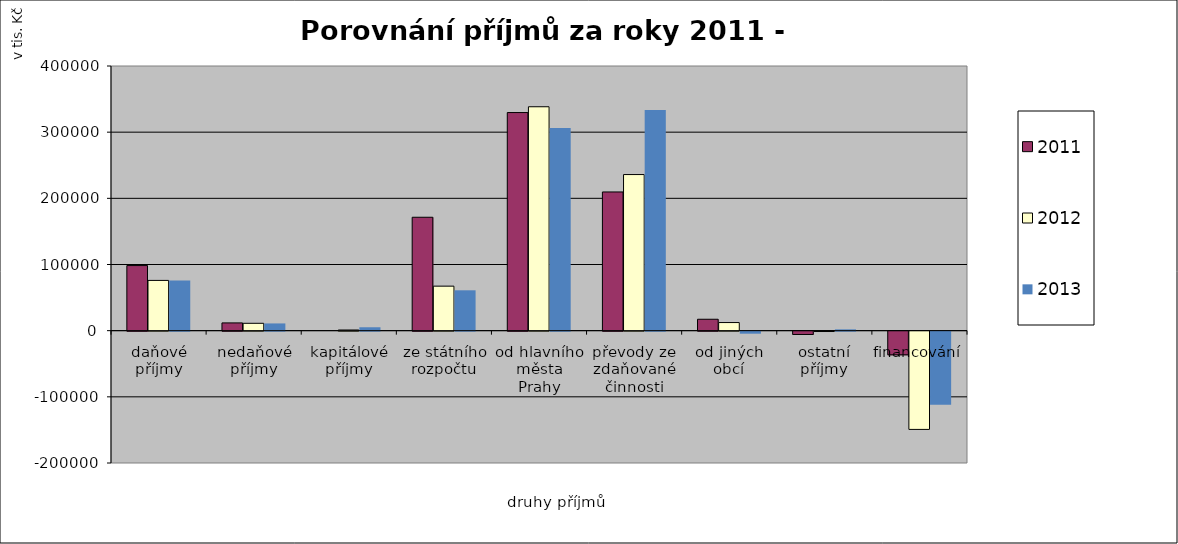
| Category | 2011 | 2012 | 2013 |
|---|---|---|---|
| daňové příjmy | 98372 | 75958.2 | 75770 |
| nedaňové příjmy | 11715.6 | 11135.7 | 10930 |
| kapitálové příjmy | 0 | 1000 | 5156.1 |
| ze státního rozpočtu | 171405 | 67292 | 61009.4 |
| od hlavního města Prahy | 329646.9 | 338399.6 | 306214.4 |
| převody ze zdaňované činnosti | 209631.7 | 235934.5 | 333599.6 |
| od jiných obcí | 17254.3 | 12250 | -3072.5 |
| ostatní příjmy | -5000 | -538.4 | 2003.1 |
| financování | -35748.8 | -148475 | -110266 |